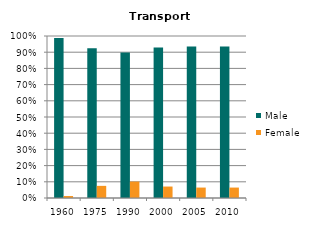
| Category | Male | Female |
|---|---|---|
| 1960.0 | 0.988 | 0.012 |
| 1975.0 | 0.925 | 0.075 |
| 1990.0 | 0.898 | 0.102 |
| 2000.0 | 0.929 | 0.071 |
| 2005.0 | 0.936 | 0.064 |
| 2010.0 | 0.936 | 0.064 |